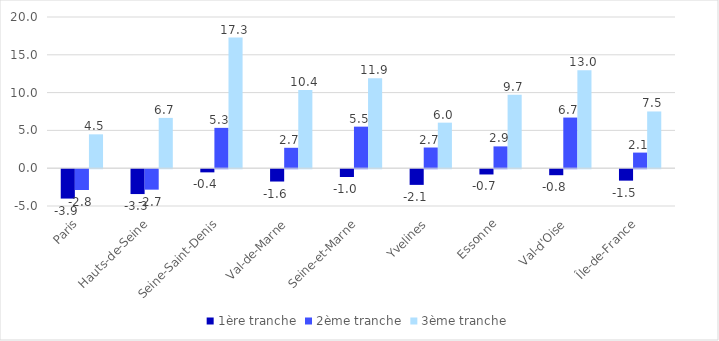
| Category | 1ère tranche | 2ème tranche | 3ème tranche |
|---|---|---|---|
| Paris | -3.885 | -2.754 | 4.48 |
| Hauts-de-Seine | -3.288 | -2.706 | 6.653 |
| Seine-Saint-Denis | -0.418 | 5.335 | 17.279 |
| Val-de-Marne | -1.631 | 2.699 | 10.351 |
| Seine-et-Marne | -1.03 | 5.496 | 11.888 |
| Yvelines | -2.074 | 2.736 | 6.024 |
| Essonne | -0.697 | 2.884 | 9.725 |
| Val-d'Oise | -0.794 | 6.698 | 12.97 |
| Île-de-France | -1.515 | 2.064 | 7.504 |